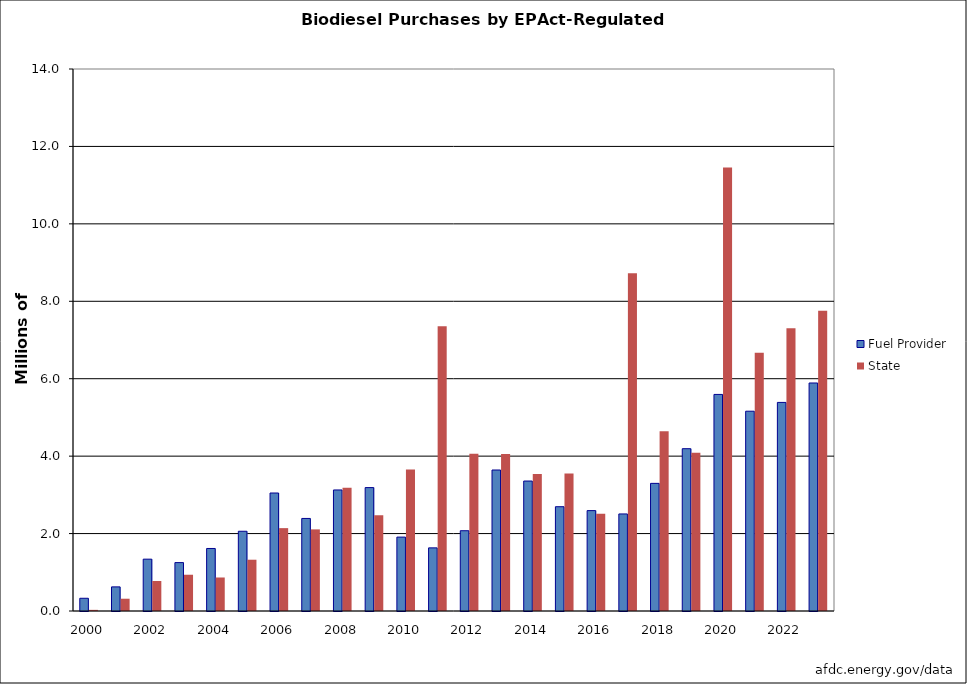
| Category | Fuel Provider | State |
|---|---|---|
| 2000.0 | 328700 | 29547 |
| 2001.0 | 622942 | 317250 |
| 2002.0 | 1338747 | 775041 |
| 2003.0 | 1250302 | 936616 |
| 2004.0 | 1615090 | 865485 |
| 2005.0 | 2059643 | 1324604 |
| 2006.0 | 3047855 | 2140564 |
| 2007.0 | 2390838 | 2107977 |
| 2008.0 | 3126348 | 3183212 |
| 2009.0 | 3187327 | 2471265 |
| 2010.0 | 1908758 | 3658164 |
| 2011.0 | 1630830 | 7354160 |
| 2012.0 | 2073597 | 4063314 |
| 2013.0 | 3641756 | 4057722 |
| 2014.0 | 3357118 | 3541764 |
| 2015.0 | 2693851 | 3551643 |
| 2016.0 | 2593058 | 2515122 |
| 2017.0 | 2506867 | 8727038 |
| 2018.0 | 3296781 | 4640663 |
| 2019.0 | 4192217 | 4090221 |
| 2020.0 | 5593923 | 11453926 |
| 2021.0 | 5160769 | 6671673 |
| 2022.0 | 5387642 | 7300646 |
| 2023.0 | 5889537 | 7756237 |